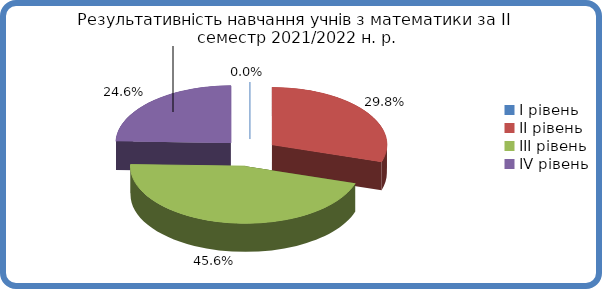
| Category | Series 0 |
|---|---|
| 0 | 0 |
| 1 | 0.298 |
| 2 | 0.456 |
| 3 | 0.246 |